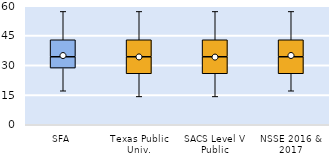
| Category | 25th | 50th | 75th |
|---|---|---|---|
| SFA | 28.571 | 5.714 | 8.571 |
| Texas Public Univ. | 25.714 | 8.571 | 8.571 |
| SACS Level V Public | 25.714 | 8.571 | 8.571 |
| NSSE 2016 & 2017 | 25.714 | 8.571 | 8.571 |